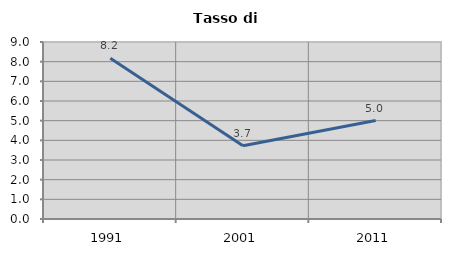
| Category | Tasso di disoccupazione   |
|---|---|
| 1991.0 | 8.172 |
| 2001.0 | 3.728 |
| 2011.0 | 5.008 |